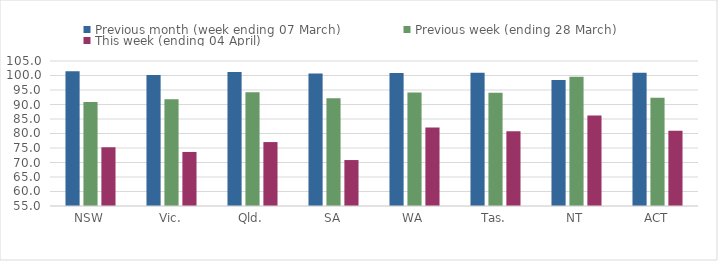
| Category | Previous month (week ending 07 March) | Previous week (ending 28 March) | This week (ending 04 April) |
|---|---|---|---|
| NSW | 101.45 | 90.841 | 75.253 |
| Vic. | 100.168 | 91.798 | 73.64 |
| Qld. | 101.205 | 94.235 | 77.044 |
| SA | 100.722 | 92.188 | 70.849 |
| WA | 100.855 | 94.161 | 82.038 |
| Tas. | 100.907 | 94.094 | 80.795 |
| NT | 98.483 | 99.604 | 86.214 |
| ACT | 100.963 | 92.314 | 80.975 |